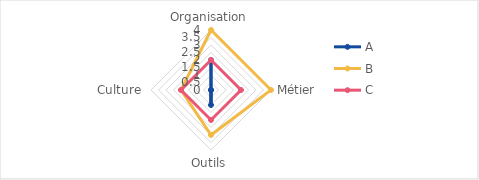
| Category | A | B | C |
|---|---|---|---|
| Organisation | 2 | 4 | 2 |
| Métier | 0 | 4 | 2 |
| Outils | 1 | 3 | 2 |
| Culture | 0 | 2 | 2 |